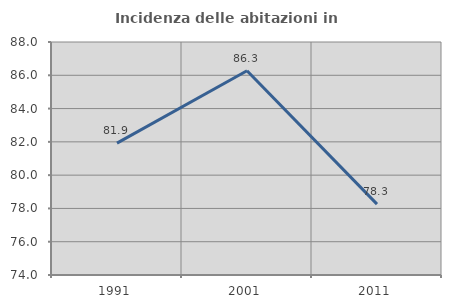
| Category | Incidenza delle abitazioni in proprietà  |
|---|---|
| 1991.0 | 81.921 |
| 2001.0 | 86.275 |
| 2011.0 | 78.261 |